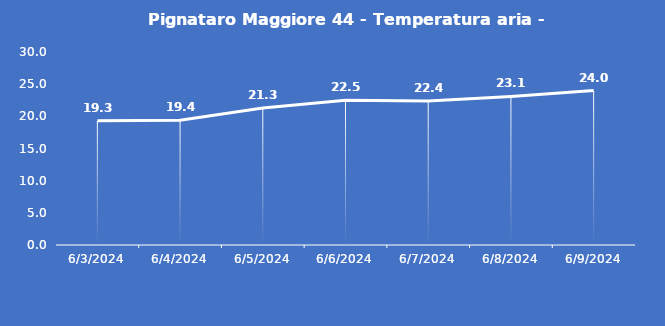
| Category | Pignataro Maggiore 44 - Temperatura aria - Grezzo (°C) |
|---|---|
| 6/3/24 | 19.3 |
| 6/4/24 | 19.4 |
| 6/5/24 | 21.3 |
| 6/6/24 | 22.5 |
| 6/7/24 | 22.4 |
| 6/8/24 | 23.1 |
| 6/9/24 | 24 |